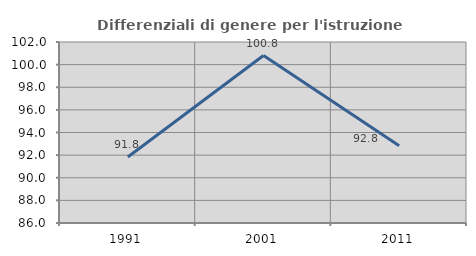
| Category | Differenziali di genere per l'istruzione superiore |
|---|---|
| 1991.0 | 91.833 |
| 2001.0 | 100.802 |
| 2011.0 | 92.826 |